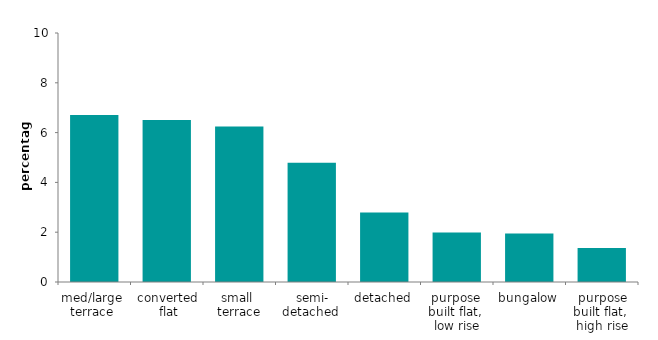
| Category | Series 0 |
|---|---|
| med/large 
terrace  | 6.703 |
| converted
 flat | 6.502 |
| small 
terrace | 6.249 |
| semi-
detached 
 | 4.794 |
| detached | 2.788 |
| purpose 
built flat, 
low rise | 1.986 |
| bungalow | 1.952 |
| purpose built flat, 
high rise | 1.367 |